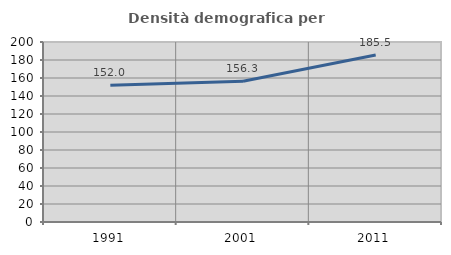
| Category | Densità demografica |
|---|---|
| 1991.0 | 151.979 |
| 2001.0 | 156.295 |
| 2011.0 | 185.457 |